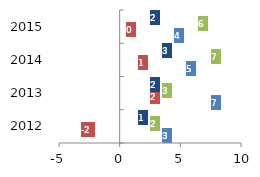
| Category | ACC Ltd Other variable cost | Ambuja Cement Other variable cost | JK Lakshmi Cement Other variable cost | Ultratech Cement Other variable cost |
|---|---|---|---|---|
| 2012.0 | 3 | -2 | 2 | 1 |
| 2013.0 | 7 | 2 | 3 | 2 |
| 2014.0 | 5 | 1 | 7 | 3 |
| 2015.0 | 4 | 0 | 6 | 2 |